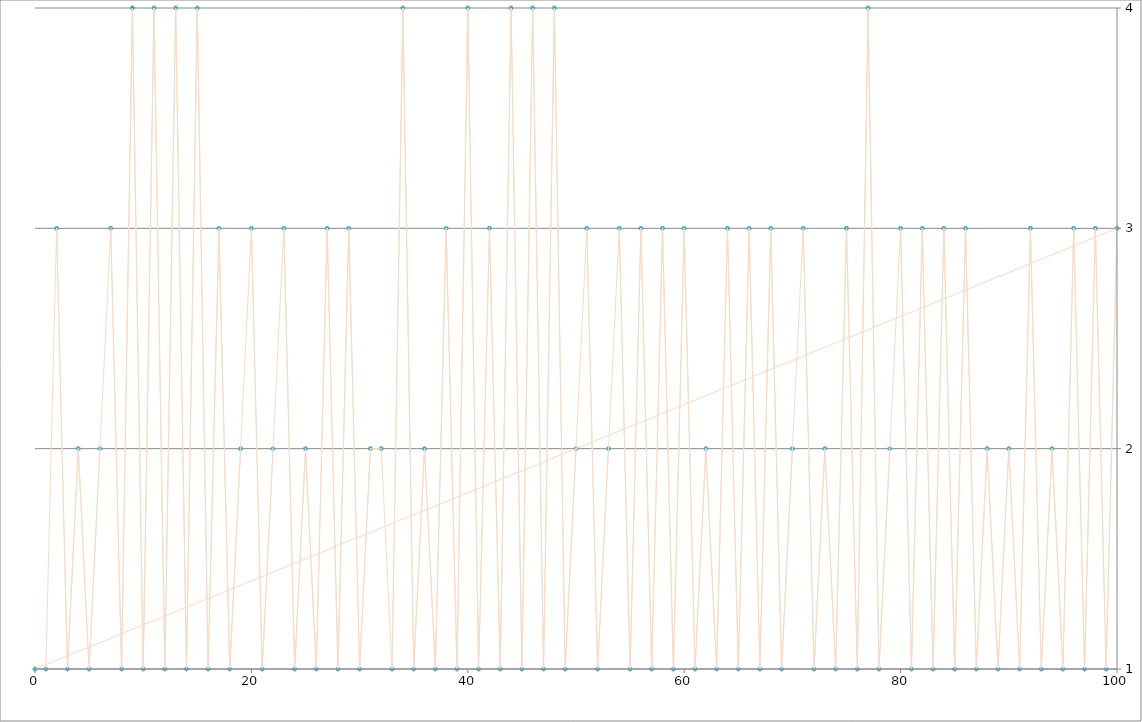
| Category | Series 0 |
|---|---|
| 0.0 | 0 |
| 1.0 | 1 |
| 2.0 | 3 |
| 3.0 | 1 |
| 4.0 | 2 |
| 5.0 | 1 |
| 6.0 | 2 |
| 7.0 | 3 |
| 8.0 | 1 |
| 9.0 | 4 |
| 10.0 | 1 |
| 11.0 | 4 |
| 12.0 | 1 |
| 13.0 | 4 |
| 14.0 | 1 |
| 15.0 | 4 |
| 16.0 | 1 |
| 17.0 | 3 |
| 18.0 | 1 |
| 19.0 | 2 |
| 20.0 | 3 |
| 21.0 | 1 |
| 22.0 | 2 |
| 23.0 | 3 |
| 24.0 | 1 |
| 25.0 | 2 |
| 26.0 | 1 |
| 27.0 | 3 |
| 28.0 | 1 |
| 29.0 | 3 |
| 30.0 | 1 |
| 31.0 | 2 |
| 32.0 | 2 |
| 33.0 | 1 |
| 34.0 | 4 |
| 35.0 | 1 |
| 36.0 | 2 |
| 37.0 | 1 |
| 38.0 | 3 |
| 39.0 | 1 |
| 40.0 | 4 |
| 41.0 | 1 |
| 42.0 | 3 |
| 43.0 | 1 |
| 44.0 | 4 |
| 45.0 | 1 |
| 46.0 | 4 |
| 47.0 | 1 |
| 48.0 | 4 |
| 49.0 | 1 |
| 50.0 | 2 |
| 51.0 | 3 |
| 52.0 | 1 |
| 53.0 | 2 |
| 54.0 | 3 |
| 55.0 | 1 |
| 56.0 | 3 |
| 57.0 | 1 |
| 58.0 | 3 |
| 59.0 | 1 |
| 60.0 | 3 |
| 61.0 | 1 |
| 62.0 | 2 |
| 63.0 | 1 |
| 64.0 | 3 |
| 65.0 | 1 |
| 66.0 | 3 |
| 67.0 | 1 |
| 68.0 | 3 |
| 69.0 | 1 |
| 70.0 | 2 |
| 71.0 | 3 |
| 72.0 | 1 |
| 73.0 | 2 |
| 74.0 | 1 |
| 75.0 | 3 |
| 76.0 | 1 |
| 77.0 | 4 |
| 78.0 | 1 |
| 79.0 | 2 |
| 80.0 | 3 |
| 81.0 | 1 |
| 82.0 | 3 |
| 83.0 | 1 |
| 84.0 | 3 |
| 85.0 | 1 |
| 86.0 | 3 |
| 87.0 | 1 |
| 88.0 | 2 |
| 89.0 | 1 |
| 90.0 | 2 |
| 91.0 | 1 |
| 92.0 | 3 |
| 93.0 | 1 |
| 94.0 | 2 |
| 95.0 | 1 |
| 96.0 | 3 |
| 97.0 | 1 |
| 98.0 | 3 |
| 99.0 | 1 |
| 100.0 | 3 |